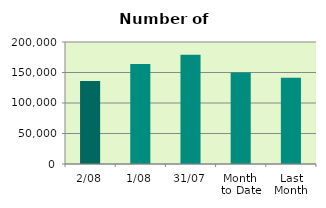
| Category | Series 0 |
|---|---|
| 2/08 | 136256 |
| 1/08 | 163736 |
| 31/07 | 179166 |
| Month 
to Date | 149996 |
| Last
Month | 141432.273 |